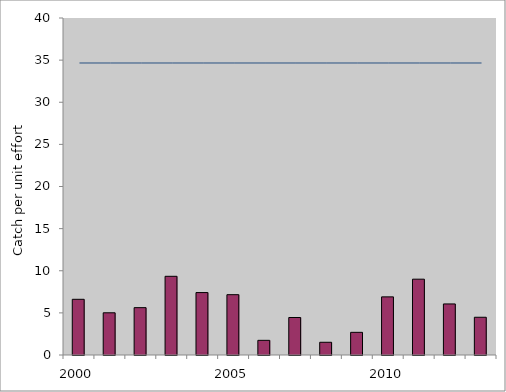
| Category | CPUE |
|---|---|
| 2000.0 | 6.61 |
| 2001.0 | 5.01 |
| 2002.0 | 5.62 |
| 2003.0 | 9.34 |
| 2004.0 | 7.41 |
| 2005.0 | 7.16 |
| 2006.0 | 1.74 |
| 2007.0 | 4.45 |
| 2008.0 | 1.51 |
| 2009.0 | 2.69 |
| 2010.0 | 6.9 |
| 2011.0 | 9 |
| 2012.0 | 6.06 |
| 2013.0 | 4.48 |